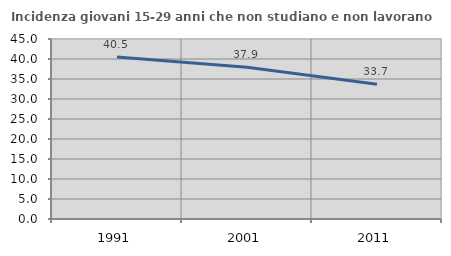
| Category | Incidenza giovani 15-29 anni che non studiano e non lavorano  |
|---|---|
| 1991.0 | 40.503 |
| 2001.0 | 37.926 |
| 2011.0 | 33.702 |